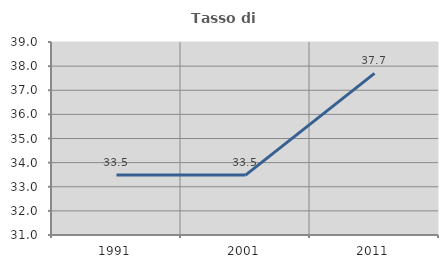
| Category | Tasso di occupazione   |
|---|---|
| 1991.0 | 33.487 |
| 2001.0 | 33.484 |
| 2011.0 | 37.697 |